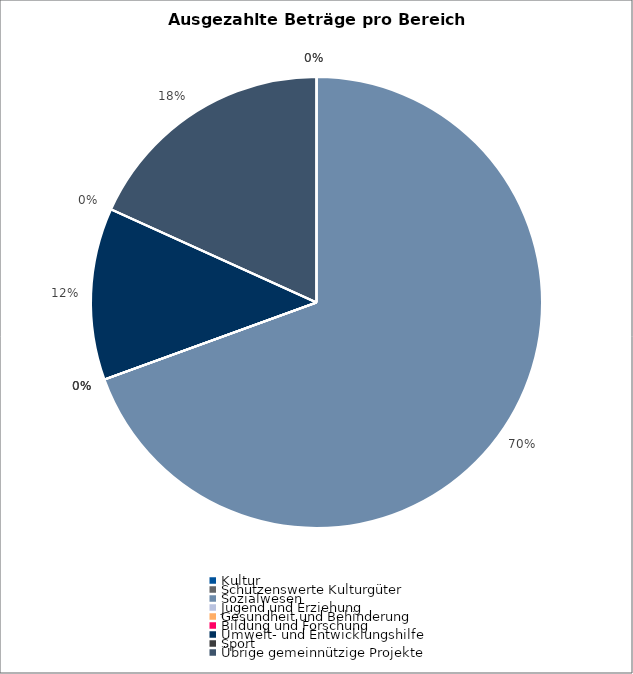
| Category | Series 0 |
|---|---|
| Kultur | 0 |
| Schützenswerte Kulturgüter | 0 |
| Sozialwesen | 304605 |
| Jugend und Erziehung | 0 |
| Gesundheit und Behinderung | 0 |
| Bildung und Forschung | 0 |
| Umwelt- und Entwicklungshilfe | 54000 |
| Sport | 0 |
| Übrige gemeinnützige Projekte | 80000 |